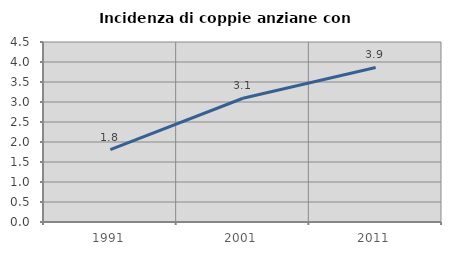
| Category | Incidenza di coppie anziane con figli |
|---|---|
| 1991.0 | 1.809 |
| 2001.0 | 3.093 |
| 2011.0 | 3.864 |